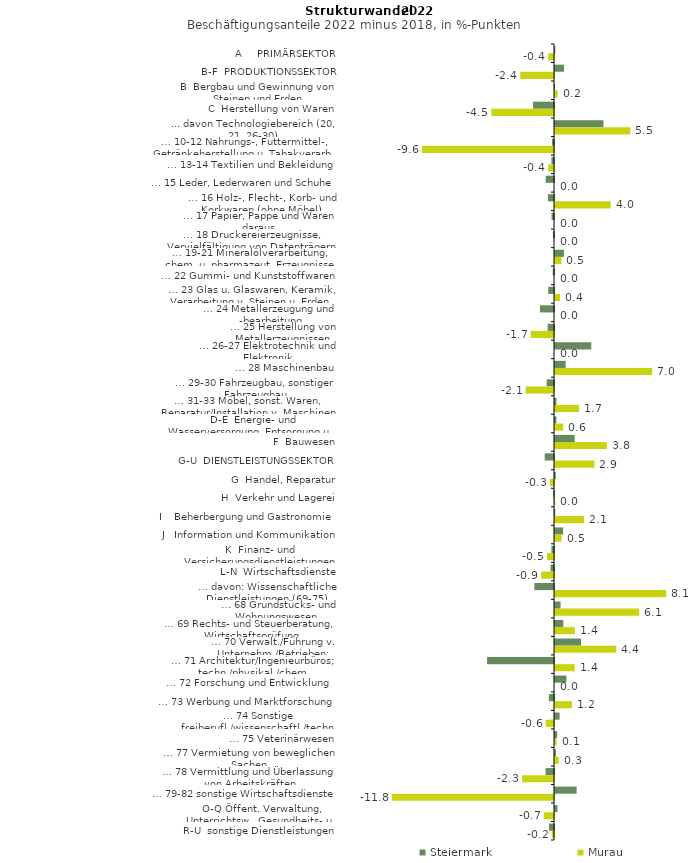
| Category | Steiermark | Murau |
|---|---|---|
| A     PRIMÄRSEKTOR | 0.025 | -0.418 |
| B-F  PRODUKTIONSSEKTOR | 0.65 | -2.443 |
| B  Bergbau und Gewinnung von Steinen und Erden | -0.011 | 0.189 |
| C  Herstellung von Waren | -1.516 | -4.534 |
| ... davon Technologiebereich (20, 21, 26-30) | 3.513 | 5.455 |
| … 10-12 Nahrungs-, Futtermittel-, Getränkeherstellung u. Tabakverarb. | -0.143 | -9.565 |
| … 13-14 Textilien und Bekleidung | -0.189 | -0.417 |
| … 15 Leder, Lederwaren und Schuhe | -0.6 | 0 |
| … 16 Holz-, Flecht-, Korb- und Korkwaren (ohne Möbel)  | -0.44 | 4.033 |
| … 17 Papier, Pappe und Waren daraus  | -0.178 | 0 |
| … 18 Druckereierzeugnisse, Vervielfältigung von Datenträgern | -0.077 | 0 |
| … 19-21 Mineralölverarbeitung, chem. u. pharmazeut. Erzeugnisse | 0.646 | 0.467 |
| … 22 Gummi- und Kunststoffwaren | -0.089 | 0 |
| … 23 Glas u. Glaswaren, Keramik, Verarbeitung v. Steinen u. Erden  | -0.424 | 0.366 |
| … 24 Metallerzeugung und -bearbeitung | -1.019 | 0 |
| … 25 Herstellung von Metallerzeugnissen  | -0.459 | -1.684 |
| … 26-27 Elektrotechnik und Elektronik | 2.628 | 0 |
| … 28 Maschinenbau | 0.773 | 7.041 |
| … 29-30 Fahrzeugbau, sonstiger Fahrzeugbau | -0.534 | -2.053 |
| … 31-33 Möbel, sonst. Waren, Reparatur/Installation v. Maschinen | 0.106 | 1.734 |
| D-E  Energie- und Wasserversorgung, Entsorgung u. Rückgewinnung | 0.102 | 0.592 |
| F  Bauwesen | 1.424 | 3.753 |
| G-U  DIENSTLEISTUNGSSEKTOR | -0.676 | 2.861 |
| G  Handel, Reparatur | 0.059 | -0.274 |
| H  Verkehr und Lagerei | -0.05 | 0.022 |
| I    Beherbergung und Gastronomie | 0.02 | 2.106 |
| J   Information und Kommunikation | 0.588 | 0.483 |
| K  Finanz- und Versicherungsdienstleistungen | -0.188 | -0.503 |
| L-N  Wirtschaftsdienste | -0.252 | -0.932 |
| … davon: Wissenschaftliche Dienstleistungen (69-75) | -1.425 | 8.057 |
| … 68 Grundstücks- und Wohnungswesen  | 0.402 | 6.104 |
| … 69 Rechts- und Steuerberatung, Wirtschaftsprüfung | 0.6 | 1.44 |
| … 70 Verwalt./Führung v. Unternehm./Betrieben; Unternehmensberat. | 1.883 | 4.442 |
| … 71 Architektur/Ingenieurbüros; techn./physikal./chem. Untersuchung | -4.85 | 1.427 |
| … 72 Forschung und Entwicklung  | 0.828 | 0 |
| … 73 Werbung und Marktforschung | -0.372 | 1.23 |
| … 74 Sonstige freiberufl./wissenschaftl./techn. Tätigkeiten | 0.334 | -0.595 |
| … 75 Veterinärwesen | 0.152 | 0.112 |
| … 77 Vermietung von beweglichen Sachen  | 0.067 | 0.27 |
| … 78 Vermittlung und Überlassung von Arbeitskräften | -0.611 | -2.312 |
| … 79-82 sonstige Wirtschaftsdienste | 1.569 | -11.754 |
| O-Q Öffent. Verwaltung, Unterrichtsw., Gesundheits- u. Sozialwesen | 0.182 | -0.745 |
| R-U  sonstige Dienstleistungen | -0.359 | -0.157 |